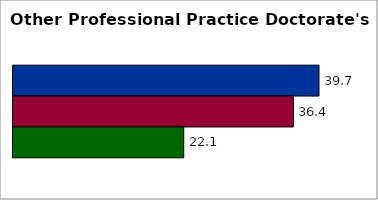
| Category | 50 states and D.C. | SREB states | State |
|---|---|---|---|
| 0 | 39.68 | 36.37 | 22.143 |